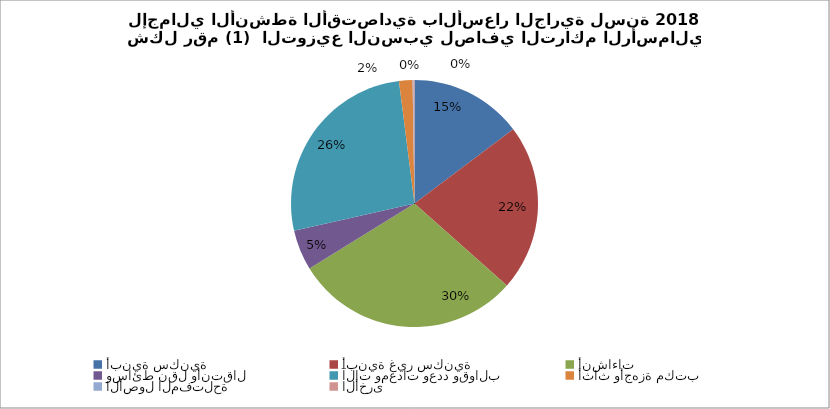
| Category | Series 0 |
|---|---|
| أبنية سكنية | 37573145.174 |
| أبنية غير سكنية | 55625829.697 |
| أنشاءات | 75578397.25 |
| وسائط نقل وأنتقال | 13415612.034 |
| آلات ومعدات وعدد وقوالب | 67688437.553 |
| أثاث وأجهزة مكتب | 4500411.513 |
| الأصول المفتلحة | 262654.872 |
| الأخرى  | 371858.07 |